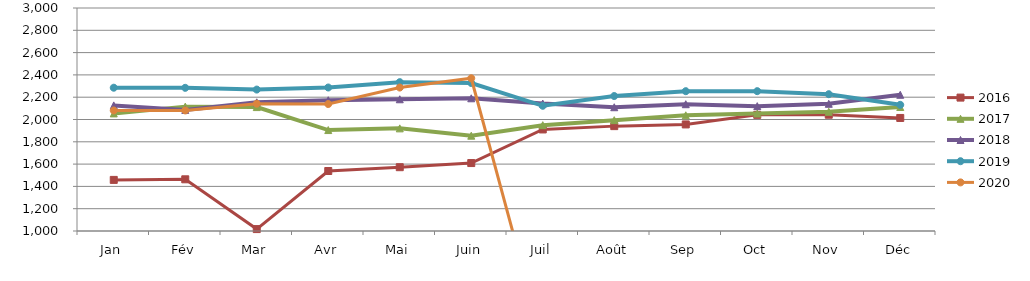
| Category | 2015 | 2016 | 2017 | 2018 | 2019 | 2020 |
|---|---|---|---|---|---|---|
| Jan |  | 1458.367 | 2054.548 | 2126.43 | 2285.077 | 2081.175 |
| Fév |  | 1463.569 | 2115.464 | 2086.116 | 2284.041 | 2081.178 |
| Mar |  | 1017.2 | 2111.342 | 2154.19 | 2268.401 | 2141.7 |
| Avr |  | 1538.072 | 1905.351 | 2172.692 | 2286.951 | 2138.761 |
| Mai |  | 1572.182 | 1920.479 | 2181.426 | 2334.869 | 2286.526 |
| Juin |  | 1609.355 | 1854.713 | 2190.216 | 2327.493 | 2369.765 |
| Juil |  | 1910.74 | 1949.204 | 2142.84 | 2123.041 | 0 |
| Août |  | 1940.578 | 1993.991 | 2110.076 | 2210.394 | 0 |
| Sep |  | 1955.778 | 2037.81 | 2137.072 | 2253.916 | 0 |
| Oct |  | 2041.667 | 2053.581 | 2119.873 | 2254.192 | 0 |
| Nov |  | 2042.699 | 2069.345 | 2140.872 | 2226.879 | 0 |
| Déc |  | 2013.752 | 2111.996 | 2221.568 | 2131.58 | 0 |